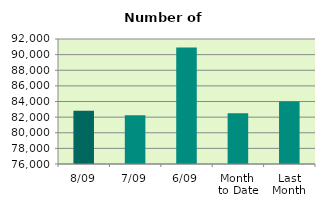
| Category | Series 0 |
|---|---|
| 8/09 | 82824 |
| 7/09 | 82238 |
| 6/09 | 90900 |
| Month 
to Date | 82500.333 |
| Last
Month | 83988.522 |